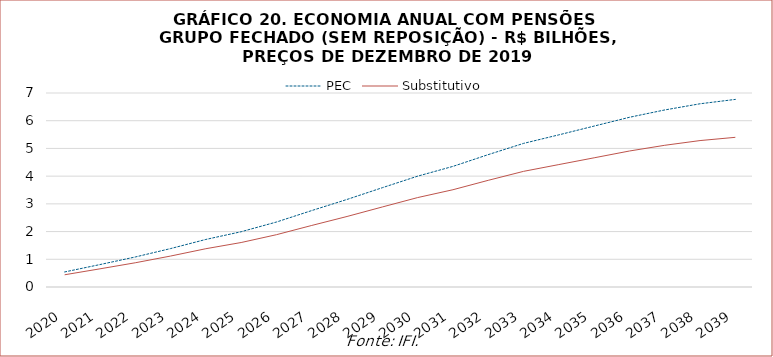
| Category | PEC | Substitutivo |
|---|---|---|
| 2020.0 | 543219423.409 | 440923031.455 |
| 2021.0 | 809410578.654 | 655636414.764 |
| 2022.0 | 1082875543.207 | 874339409.142 |
| 2023.0 | 1385964527.911 | 1116560186.163 |
| 2024.0 | 1716033991.438 | 1381613563.24 |
| 2025.0 | 1994072267.879 | 1604864903.332 |
| 2026.0 | 2344476693.665 | 1887309895.901 |
| 2027.0 | 2758136297.43 | 2220899722.309 |
| 2028.0 | 3159650412.218 | 2544529658.019 |
| 2029.0 | 3583246646.791 | 2887950501.886 |
| 2030.0 | 3999268144.969 | 3226981938.204 |
| 2031.0 | 4352128255.763 | 3510034719.109 |
| 2032.0 | 4776702923.014 | 3849466456.897 |
| 2033.0 | 5181741089.482 | 4172976471.34 |
| 2034.0 | 5489900836.691 | 4417542005.232 |
| 2035.0 | 5807106193.214 | 4661770217.41 |
| 2036.0 | 6123702772.589 | 4906868583.655 |
| 2037.0 | 6388607612.904 | 5113256711.861 |
| 2038.0 | 6611074301.108 | 5283602473.119 |
| 2039.0 | 6768699921.756 | 5400713840.813 |